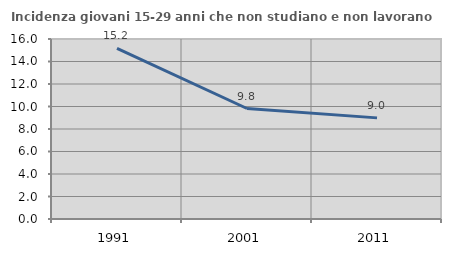
| Category | Incidenza giovani 15-29 anni che non studiano e non lavorano  |
|---|---|
| 1991.0 | 15.175 |
| 2001.0 | 9.821 |
| 2011.0 | 8.989 |